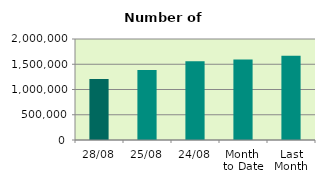
| Category | Series 0 |
|---|---|
| 28/08 | 1209796 |
| 25/08 | 1386264 |
| 24/08 | 1557750 |
| Month 
to Date | 1595807.2 |
| Last
Month | 1667155.619 |